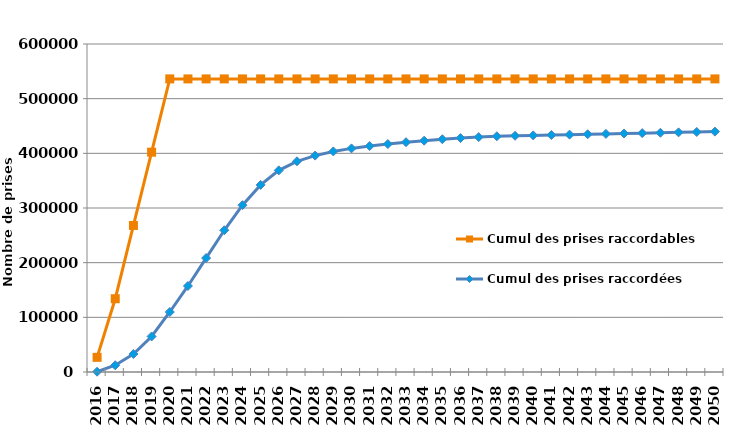
| Category | Cumul des prises raccordables | Cumul des prises raccordées |
|---|---|---|
| 2016.0 | 26809 | 518.736 |
| 2017.0 | 134042 | 12330.54 |
| 2018.0 | 268083 | 32880.011 |
| 2019.0 | 402124 | 64998.015 |
| 2020.0 | 536163 | 109783.864 |
| 2021.0 | 536163 | 157385.276 |
| 2022.0 | 536163 | 208426.468 |
| 2023.0 | 536163 | 259273.496 |
| 2024.0 | 536163 | 305134.954 |
| 2025.0 | 536163 | 342262.626 |
| 2026.0 | 536163 | 368860.352 |
| 2027.0 | 536163 | 385447.529 |
| 2028.0 | 536163 | 395844.15 |
| 2029.0 | 536163 | 403469.596 |
| 2030.0 | 536163 | 409034.785 |
| 2031.0 | 536163 | 413335.398 |
| 2032.0 | 536163 | 416947.322 |
| 2033.0 | 536163 | 420344.78 |
| 2034.0 | 536163 | 423149.947 |
| 2035.0 | 536163 | 425782.778 |
| 2036.0 | 536163 | 427910.589 |
| 2037.0 | 536163 | 429731.399 |
| 2038.0 | 536163 | 431237.118 |
| 2039.0 | 536163 | 432125.481 |
| 2040.0 | 536163 | 432816.24 |
| 2041.0 | 536163 | 433507.24 |
| 2042.0 | 536163 | 434198.24 |
| 2043.0 | 536163 | 434889.24 |
| 2044.0 | 536163 | 435580.24 |
| 2045.0 | 536163 | 436271.24 |
| 2046.0 | 536163 | 436962.24 |
| 2047.0 | 536163 | 437653.24 |
| 2048.0 | 536163 | 438344.24 |
| 2049.0 | 536163 | 439035.24 |
| 2050.0 | 536163 | 439726.24 |